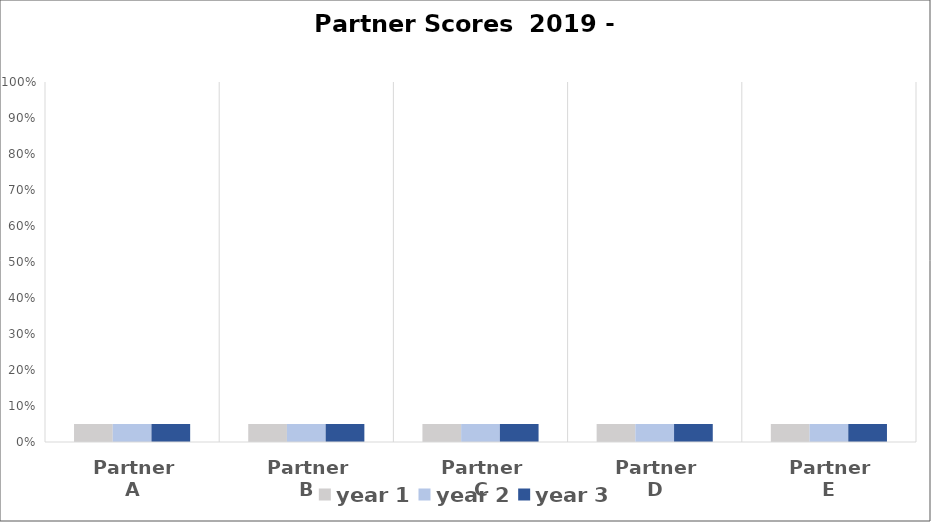
| Category | year 1 | year 2 | year 3 |
|---|---|---|---|
| Partner A | 0.05 | 0.05 | 0.05 |
| Partner B | 0.05 | 0.05 | 0.05 |
| Partner C | 0.05 | 0.05 | 0.05 |
| Partner D | 0.05 | 0.05 | 0.05 |
| Partner E | 0.05 | 0.05 | 0.05 |